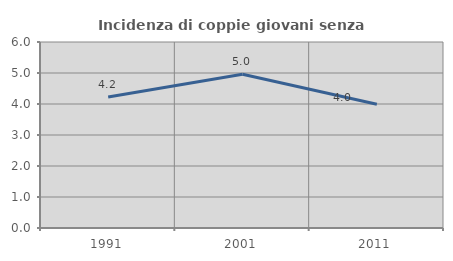
| Category | Incidenza di coppie giovani senza figli |
|---|---|
| 1991.0 | 4.227 |
| 2001.0 | 4.961 |
| 2011.0 | 3.99 |